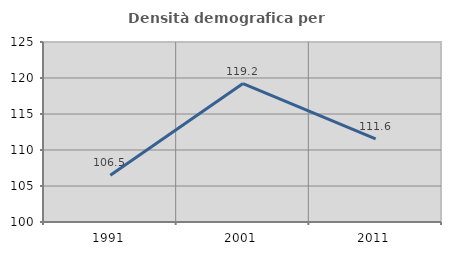
| Category | Densità demografica |
|---|---|
| 1991.0 | 106.5 |
| 2001.0 | 119.228 |
| 2011.0 | 111.554 |